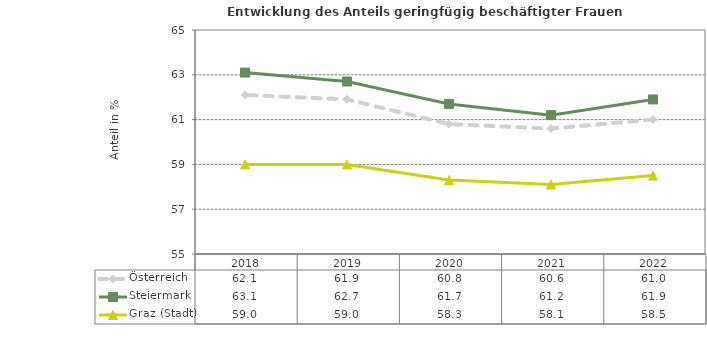
| Category | Österreich | Steiermark | Graz (Stadt) |
|---|---|---|---|
| 2022.0 | 61 | 61.9 | 58.5 |
| 2021.0 | 60.6 | 61.2 | 58.1 |
| 2020.0 | 60.8 | 61.7 | 58.3 |
| 2019.0 | 61.9 | 62.7 | 59 |
| 2018.0 | 62.1 | 63.1 | 59 |